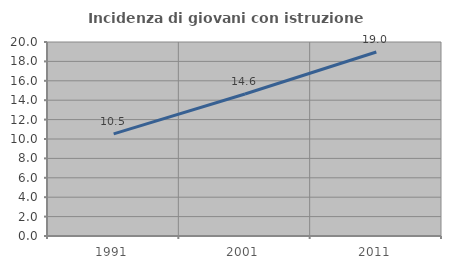
| Category | Incidenza di giovani con istruzione universitaria |
|---|---|
| 1991.0 | 10.526 |
| 2001.0 | 14.634 |
| 2011.0 | 18.966 |